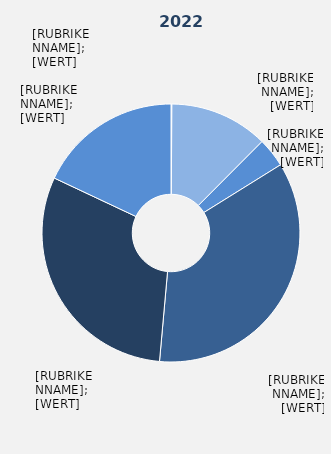
| Category | Series 1 |
|---|---|
| Land- und Forstwirtschaft, Fischerei | 0.11 |
| Produzierendes Gewerbe ohne Baugewerbe | 12.356 |
| Baugewerbe | 3.673 |
| Handel, Verkehr und Lagerei, Gastgewerbe, 
Information und Kommunikation | 35.284 |
| Finanz-, Versicherungs- und 
Unternehmensdienstleister, 
Grundstücks- und Wohnungswesen | 30.58 |
| Öffentliche und sonstige 
Dienstleister, Erziehung, 
Unterricht | 17.996 |